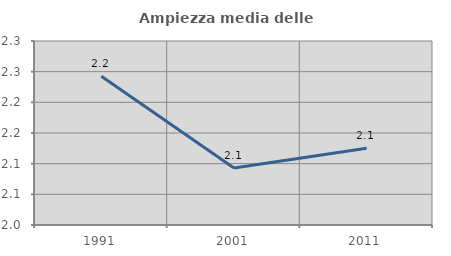
| Category | Ampiezza media delle famiglie |
|---|---|
| 1991.0 | 2.243 |
| 2001.0 | 2.093 |
| 2011.0 | 2.125 |